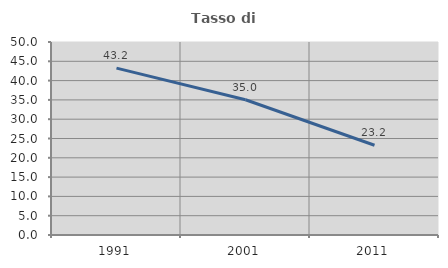
| Category | Tasso di occupazione   |
|---|---|
| 1991.0 | 43.233 |
| 2001.0 | 35.041 |
| 2011.0 | 23.245 |